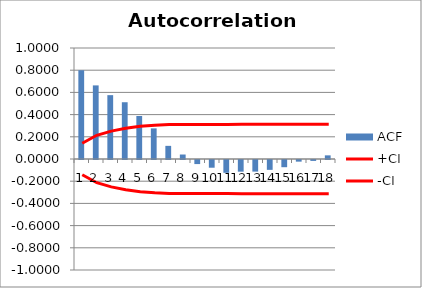
| Category | ACF |
|---|---|
| 0 | 0.8 |
| 1 | 0.663 |
| 2 | 0.575 |
| 3 | 0.511 |
| 4 | 0.388 |
| 5 | 0.276 |
| 6 | 0.118 |
| 7 | 0.04 |
| 8 | -0.037 |
| 9 | -0.07 |
| 10 | -0.115 |
| 11 | -0.105 |
| 12 | -0.105 |
| 13 | -0.089 |
| 14 | -0.065 |
| 15 | -0.015 |
| 16 | -0.008 |
| 17 | 0.033 |